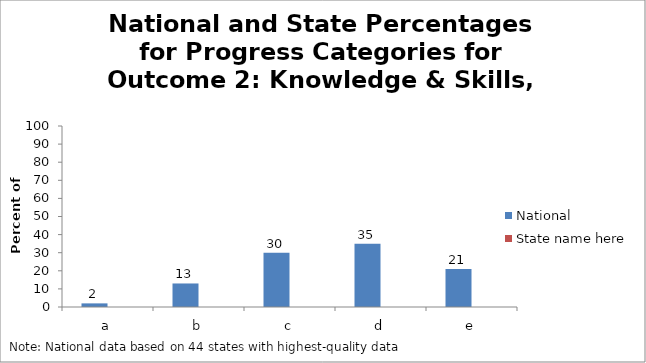
| Category | National | State name here |
|---|---|---|
| a | 2 |  |
| b | 13 |  |
| c | 30 |  |
| d | 35 |  |
| e | 21 |  |